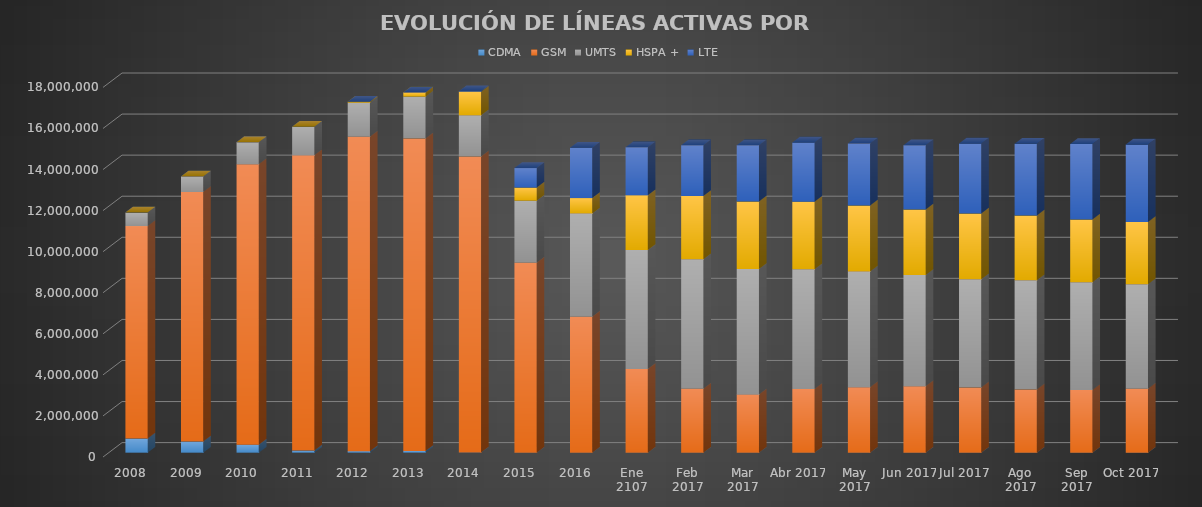
| Category | CDMA | GSM | UMTS | HSPA + | LTE |
|---|---|---|---|---|---|
| 2008 | 688357 | 10346902 | 656989 | 0 | 0 |
| 2009 | 544313 | 12151710 | 758577 | 0 | 0 |
| 2010 | 389834 | 13657394 | 1071603 | 0 | 0 |
| 2011 | 102115 | 14379423 | 1393020 | 0 | 0 |
| 2012 | 75179 | 15310006 | 1658596 | 43082 | 0 |
| 2013 | 83748 | 15215287 | 2043321 | 199398 | 0 |
| 2014 | 3009 | 14418144 | 2006405 | 1148823 | 28176 |
| 2015 | 0 | 9252920 | 3019889 | 636488 | 949723 |
| 2016 | 0 | 6621574 | 5027714 | 748032 | 2450814 |
| Ene 2107 | 0 | 4077503.931 | 5791273 | 2666950 | 2337499 |
| Feb 2017 | 0 | 3113374 | 6306926 | 3083549 | 2465632 |
| Mar 2017 | 0 | 2835527 | 6108473 | 3286428 | 2740639 |
| Abr 2017 | 0 | 3104390 | 5824513 | 3296921 | 2878643 |
| May 2017 | 0 | 3192252 | 5635221 | 3207620 | 3026765 |
| Jun 2017 | 0 | 3237012 | 5410989 | 3195204 | 3133566 |
| Jul 2017 | 0 | 3171660 | 5272378 | 3200692 | 3410480 |
| Ago 2017 | 0 | 3077260 | 5317796 | 3149750 | 3505191 |
| Sep 2017 | 0 | 3047450 | 5250076 | 3057317 | 3682378 |
| Oct 2017 | 0 | 3109269 | 5099274 | 3028513 | 3771733 |